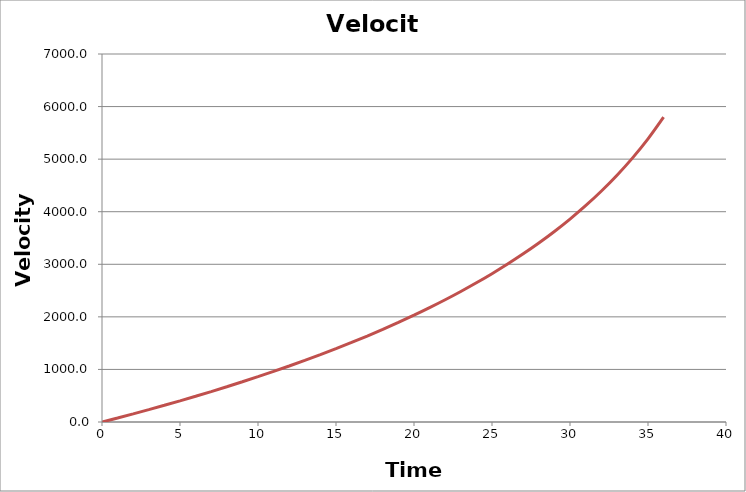
| Category | Velocity |
|---|---|
| 0.0 | 0 |
| 1.0 | 76.744 |
| 2.0 | 155.316 |
| 3.0 | 235.803 |
| 4.0 | 318.303 |
| 5.0 | 402.919 |
| 6.0 | 489.761 |
| 7.0 | 578.95 |
| 8.0 | 670.617 |
| 9.0 | 764.902 |
| 10.0 | 861.961 |
| 11.0 | 961.961 |
| 12.0 | 1065.086 |
| 13.0 | 1171.538 |
| 14.0 | 1281.538 |
| 15.0 | 1395.331 |
| 16.0 | 1513.188 |
| 17.0 | 1635.41 |
| 18.0 | 1762.333 |
| 19.0 | 1894.333 |
| 20.0 | 2031.833 |
| 21.0 | 2175.312 |
| 22.0 | 2325.312 |
| 23.0 | 2482.455 |
| 24.0 | 2647.455 |
| 25.0 | 2821.139 |
| 26.0 | 3004.472 |
| 27.0 | 3198.59 |
| 28.0 | 3404.84 |
| 29.0 | 3624.84 |
| 30.0 | 3860.554 |
| 31.0 | 4114.4 |
| 32.0 | 4389.4 |
| 33.0 | 4689.4 |
| 34.0 | 5019.4 |
| 35.0 | 5386.067 |
| 36.0 | 5798.567 |